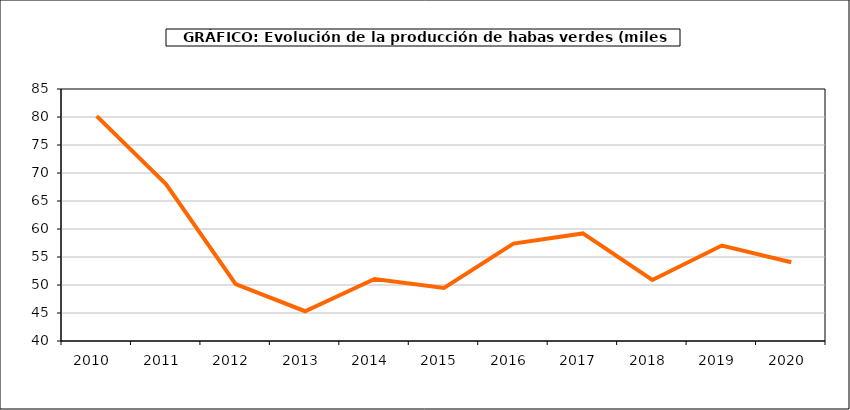
| Category | producción |
|---|---|
| 2010.0 | 80.156 |
| 2011.0 | 67.971 |
| 2012.0 | 50.149 |
| 2013.0 | 45.318 |
| 2014.0 | 51.081 |
| 2015.0 | 49.478 |
| 2016.0 | 57.4 |
| 2017.0 | 59.21 |
| 2018.0 | 50.9 |
| 2019.0 | 57.049 |
| 2020.0 | 54.067 |